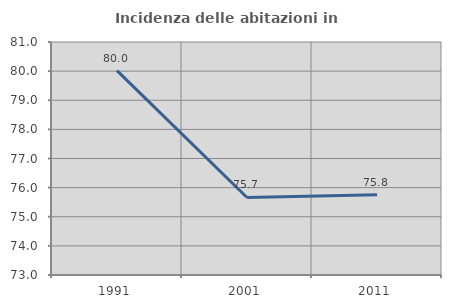
| Category | Incidenza delle abitazioni in proprietà  |
|---|---|
| 1991.0 | 80.018 |
| 2001.0 | 75.662 |
| 2011.0 | 75.758 |